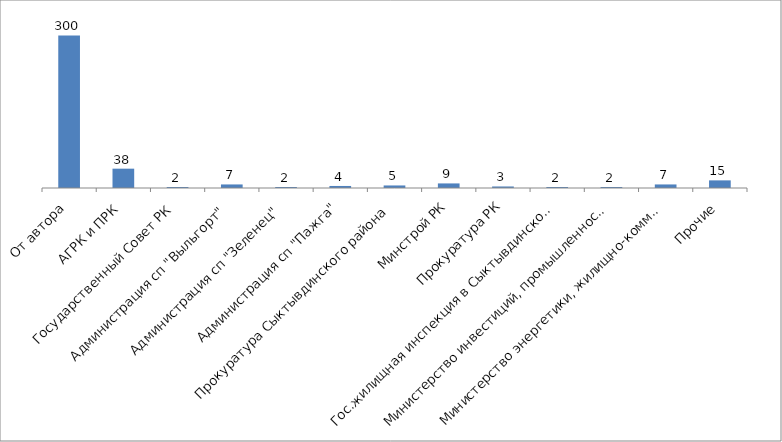
| Category | Series 0 |
|---|---|
| От автора | 300 |
| АГРК и ПРК | 38 |
| Государственный Совет РК | 2 |
| Администрация сп "Выльгорт" | 7 |
| Администрация сп "Зеленец" | 2 |
| Администрация сп "Пажга" | 4 |
| Прокуратура Сыктывдинского района | 5 |
| Минстрой РК | 9 |
| Прокуратура РК | 3 |
| Гос.жилищная инспекция в Сыктывдинском районе | 2 |
| Министерство инвестиций, промышленности и транспорта РК | 2 |
| Министерство энергетики, жилищно-коммунального хозяйства и тарифов РК | 7 |
| Прочие | 15 |